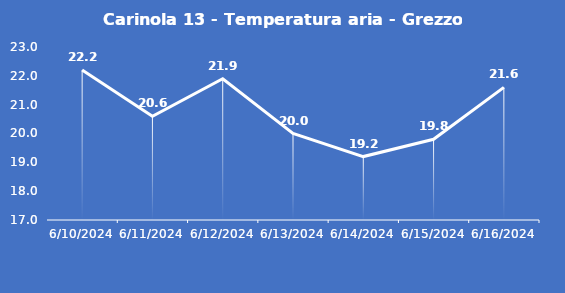
| Category | Carinola 13 - Temperatura aria - Grezzo (°C) |
|---|---|
| 6/10/24 | 22.2 |
| 6/11/24 | 20.6 |
| 6/12/24 | 21.9 |
| 6/13/24 | 20 |
| 6/14/24 | 19.2 |
| 6/15/24 | 19.8 |
| 6/16/24 | 21.6 |